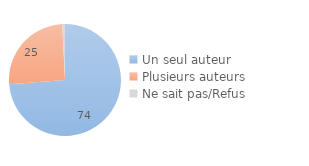
| Category | Series 0 |
|---|---|
| Un seul auteur | 73.766 |
| Plusieurs auteurs | 25.45 |
| Ne sait pas/Refus | 0.783 |